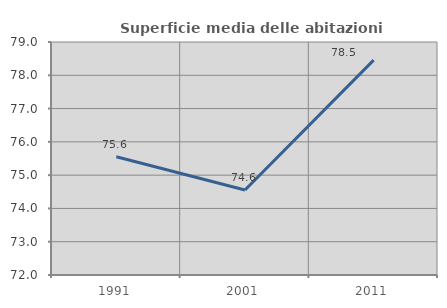
| Category | Superficie media delle abitazioni occupate |
|---|---|
| 1991.0 | 75.55 |
| 2001.0 | 74.555 |
| 2011.0 | 78.456 |